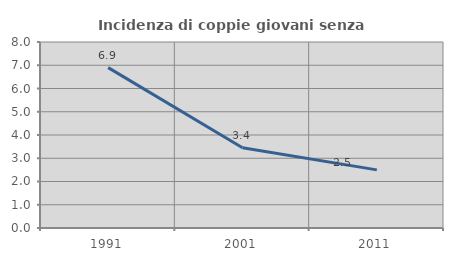
| Category | Incidenza di coppie giovani senza figli |
|---|---|
| 1991.0 | 6.897 |
| 2001.0 | 3.448 |
| 2011.0 | 2.5 |